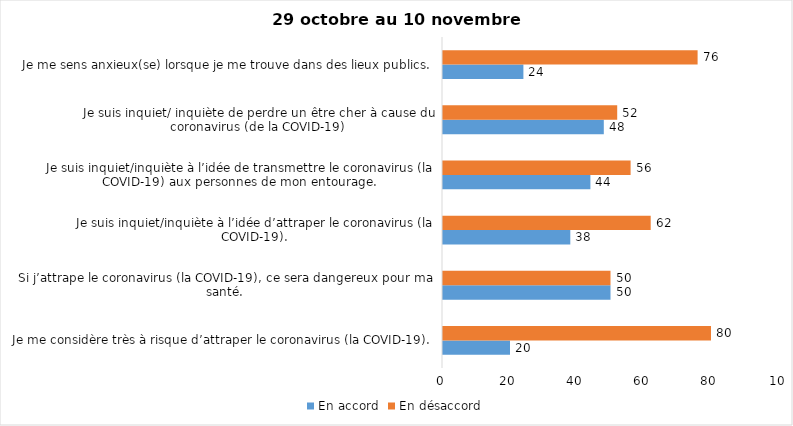
| Category | En accord | En désaccord |
|---|---|---|
| Je me considère très à risque d’attraper le coronavirus (la COVID-19). | 20 | 80 |
| Si j’attrape le coronavirus (la COVID-19), ce sera dangereux pour ma santé. | 50 | 50 |
| Je suis inquiet/inquiète à l’idée d’attraper le coronavirus (la COVID-19). | 38 | 62 |
| Je suis inquiet/inquiète à l’idée de transmettre le coronavirus (la COVID-19) aux personnes de mon entourage. | 44 | 56 |
| Je suis inquiet/ inquiète de perdre un être cher à cause du coronavirus (de la COVID-19) | 48 | 52 |
| Je me sens anxieux(se) lorsque je me trouve dans des lieux publics. | 24 | 76 |